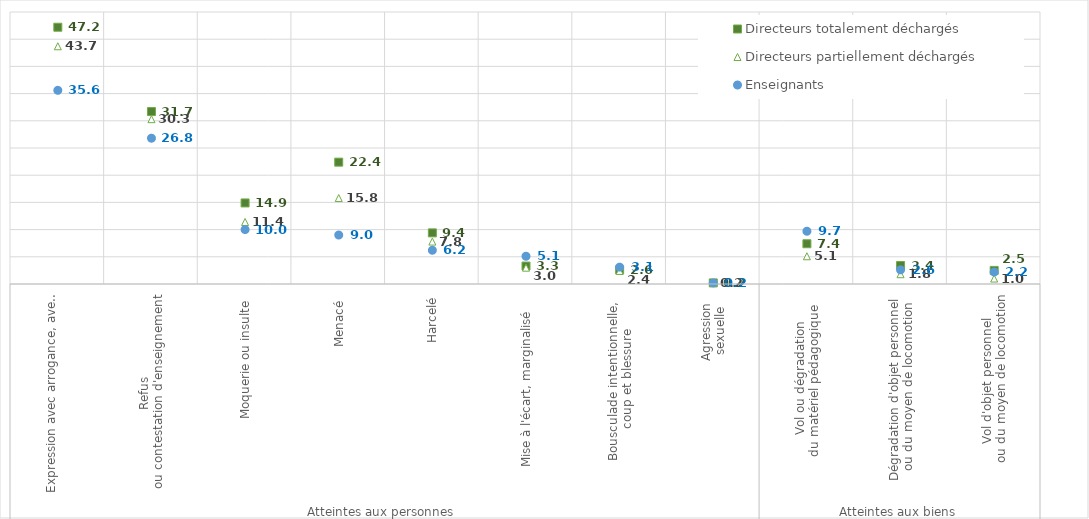
| Category | Directeurs totalement déchargés | Directeurs partiellement déchargés | Enseignants |
|---|---|---|---|
| 0 | 47.2 | 43.7 | 35.6 |
| 1 | 31.7 | 30.3 | 26.8 |
| 2 | 14.9 | 11.4 | 10 |
| 3 | 22.4 | 15.8 | 9 |
| 4 | 9.4 | 7.8 | 6.2 |
| 5 | 3.3 | 3 | 5.1 |
| 6 | 2.6 | 2.4 | 3.1 |
| 7 | 0.2 | 0.2 | 0.2 |
| 8 | 7.4 | 5.1 | 9.7 |
| 9 | 3.4 | 1.8 | 2.6 |
| 10 | 2.5 | 1 | 2.2 |